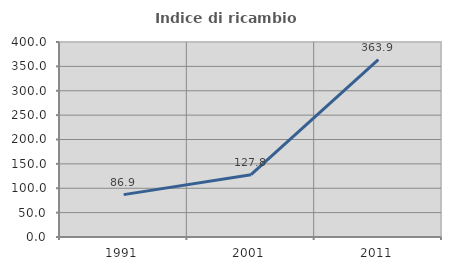
| Category | Indice di ricambio occupazionale  |
|---|---|
| 1991.0 | 86.9 |
| 2001.0 | 127.815 |
| 2011.0 | 363.855 |